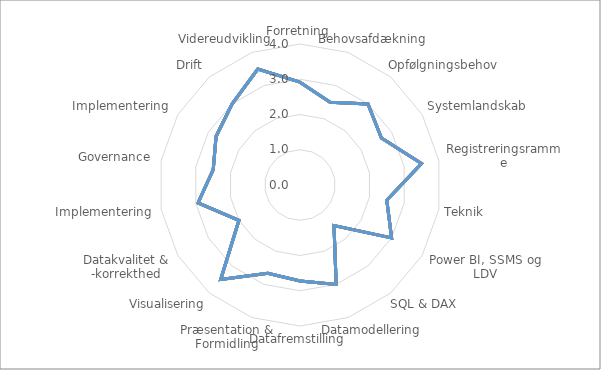
| Category | Series 4 | Series 5 | Series 6 | Series 7 | Series 2 | Series 3 | Series 1 | Series 0 |
|---|---|---|---|---|---|---|---|---|
| Forretning | 2.917 | 2.917 | 2.917 | 2.917 | 2.917 | 2.917 | 2.917 | 2.917 |
| Behovsafdækning | 2.5 | 2.5 | 2.5 | 2.5 | 2.5 | 2.5 | 2.5 | 2.5 |
| Opfølgningsbehov | 3 | 3 | 3 | 3 | 3 | 3 | 3 | 3 |
| Systemlandskab | 2.667 | 2.667 | 2.667 | 2.667 | 2.667 | 2.667 | 2.667 | 2.667 |
| Registreringsramme | 3.5 | 3.5 | 3.5 | 3.5 | 3.5 | 3.5 | 3.5 | 3.5 |
| Teknik | 2.5 | 2.5 | 2.5 | 2.5 | 2.5 | 2.5 | 2.5 | 2.5 |
| Power BI, SSMS og LDV | 3 | 3 | 3 | 3 | 3 | 3 | 3 | 3 |
| SQL & DAX | 1.5 | 1.5 | 1.5 | 1.5 | 1.5 | 1.5 | 1.5 | 1.5 |
| Datamodellering | 3 | 3 | 3 | 3 | 3 | 3 | 3 | 3 |
| Datafremstilling | 2.722 | 2.722 | 2.722 | 2.722 | 2.722 | 2.722 | 2.722 | 2.722 |
| Præsentation & Formidling | 2.667 | 2.667 | 2.667 | 2.667 | 2.667 | 2.667 | 2.667 | 2.667 |
| Visualisering | 3.5 | 3.5 | 3.5 | 3.5 | 3.5 | 3.5 | 3.5 | 3.5 |
| Datakvalitet & -korrekthed | 2 | 2 | 2 | 2 | 2 | 2 | 2 | 2 |
| Implementering | 2.938 | 2.938 | 2.938 | 2.938 | 2.938 | 2.938 | 2.938 | 2.938 |
| Governance | 2.5 | 2.5 | 2.5 | 2.5 | 2.5 | 2.5 | 2.5 | 2.5 |
| Implementering | 2.75 | 2.75 | 2.75 | 2.75 | 2.75 | 2.75 | 2.75 | 2.75 |
| Drift | 3 | 3 | 3 | 3 | 3 | 3 | 3 | 3 |
| Videreudvikling | 3.5 | 3.5 | 3.5 | 3.5 | 3.5 | 3.5 | 3.5 | 3.5 |